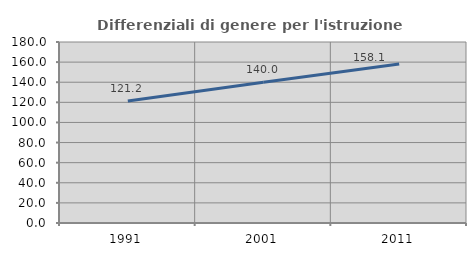
| Category | Differenziali di genere per l'istruzione superiore |
|---|---|
| 1991.0 | 121.244 |
| 2001.0 | 140.014 |
| 2011.0 | 158.096 |